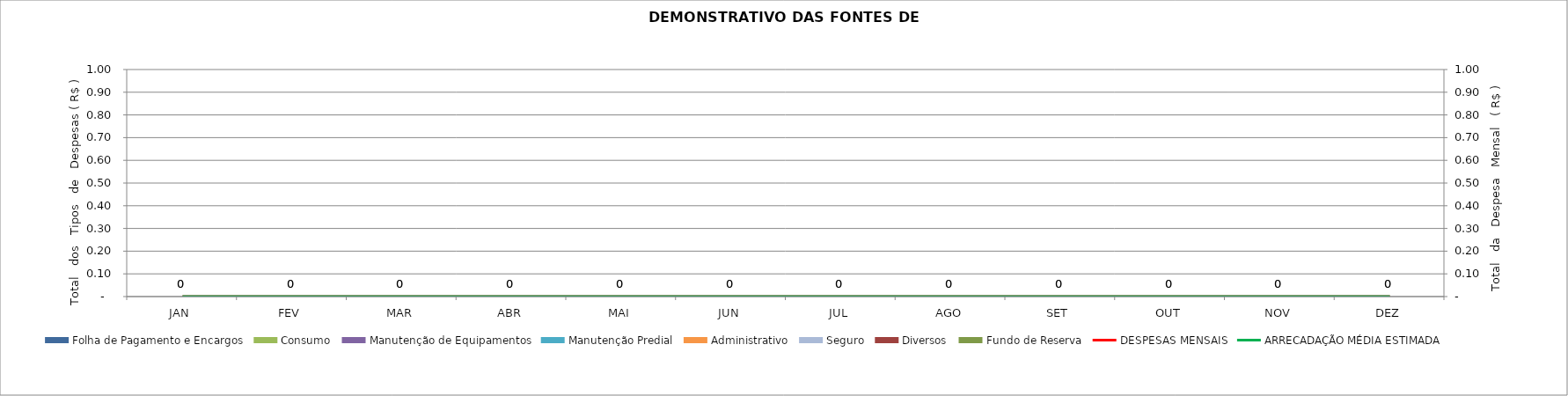
| Category | Folha de Pagamento e Encargos | Consumo | Manutenção de Equipamentos | Manutenção Predial | Administrativo | Seguro | Diversos | Fundo de Reserva |
|---|---|---|---|---|---|---|---|---|
| JAN | 0 | 0 | 0 | 0 | 0 | 0 | 0 | 0 |
| FEV | 0 | 0 | 0 | 0 | 0 | 0 | 0 | 0 |
| MAR | 0 | 0 | 0 | 0 | 0 | 0 | 0 | 0 |
| ABR | 0 | 0 | 0 | 0 | 0 | 0 | 0 | 0 |
| MAI | 0 | 0 | 0 | 0 | 0 | 0 | 0 | 0 |
| JUN | 0 | 0 | 0 | 0 | 0 | 0 | 0 | 0 |
| JUL | 0 | 0 | 0 | 0 | 0 | 0 | 0 | 0 |
| AGO | 0 | 0 | 0 | 0 | 0 | 0 | 0 | 0 |
| SET | 0 | 0 | 0 | 0 | 0 | 0 | 0 | 0 |
| OUT | 0 | 0 | 0 | 0 | 0 | 0 | 0 | 0 |
| NOV | 0 | 0 | 0 | 0 | 0 | 0 | 0 | 0 |
| DEZ | 0 | 0 | 0 | 0 | 0 | 0 | 0 | 0 |